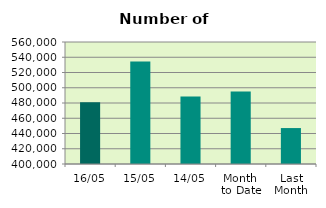
| Category | Series 0 |
|---|---|
| 16/05 | 481114 |
| 15/05 | 534512 |
| 14/05 | 488624 |
| Month 
to Date | 495204.727 |
| Last
Month | 447135.9 |